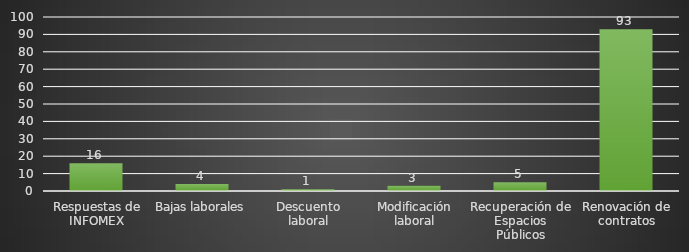
| Category | INDICADOR  |
|---|---|
| Respuestas de INFOMEX | 16 |
| Bajas laborales | 4 |
| Descuento laboral | 1 |
| Modificación laboral | 3 |
| Recuperación de Espacios Públicos | 5 |
| Renovación de contratos | 93 |